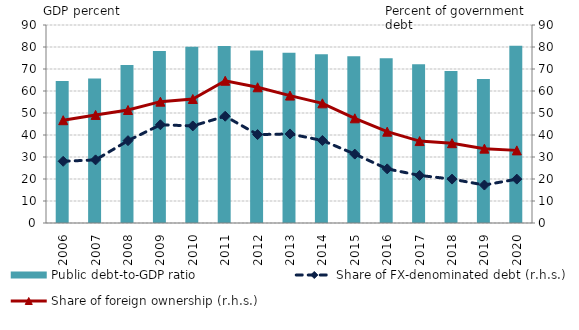
| Category | Public debt-to-GDP ratio |
|---|---|
| 2006.0 | 64.504 |
| 2007.0 | 65.654 |
| 2008.0 | 71.843 |
| 2009.0 | 78.217 |
| 2010.0 | 80.163 |
| 2011.0 | 80.442 |
| 2012.0 | 78.361 |
| 2013.0 | 77.354 |
| 2014.0 | 76.688 |
| 2015.0 | 75.821 |
| 2016.0 | 74.932 |
| 2017.0 | 72.163 |
| 2018.0 | 69.123 |
| 2019.0 | 65.479 |
| 2020.0 | 80.597 |